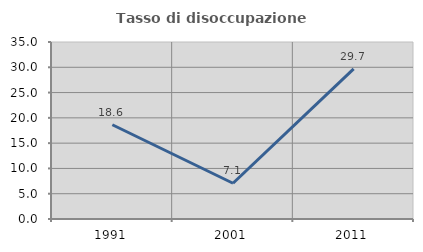
| Category | Tasso di disoccupazione giovanile  |
|---|---|
| 1991.0 | 18.634 |
| 2001.0 | 7.071 |
| 2011.0 | 29.67 |